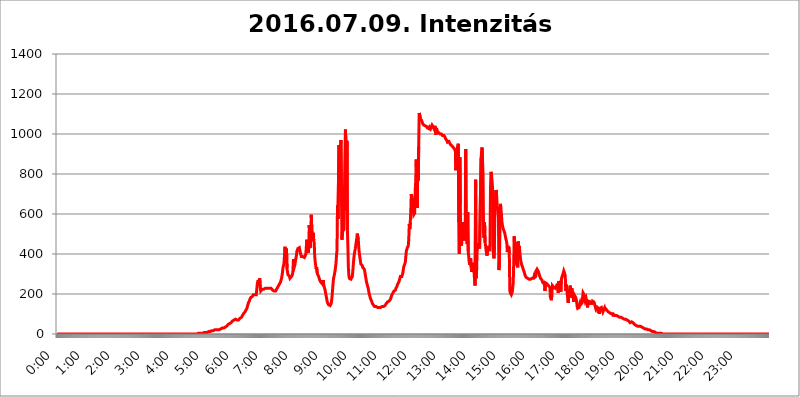
| Category | 2016.07.09. Intenzitás [W/m^2] |
|---|---|
| 0.0 | 0 |
| 0.0006944444444444445 | 0 |
| 0.001388888888888889 | 0 |
| 0.0020833333333333333 | 0 |
| 0.002777777777777778 | 0 |
| 0.003472222222222222 | 0 |
| 0.004166666666666667 | 0 |
| 0.004861111111111111 | 0 |
| 0.005555555555555556 | 0 |
| 0.0062499999999999995 | 0 |
| 0.006944444444444444 | 0 |
| 0.007638888888888889 | 0 |
| 0.008333333333333333 | 0 |
| 0.009027777777777779 | 0 |
| 0.009722222222222222 | 0 |
| 0.010416666666666666 | 0 |
| 0.011111111111111112 | 0 |
| 0.011805555555555555 | 0 |
| 0.012499999999999999 | 0 |
| 0.013194444444444444 | 0 |
| 0.013888888888888888 | 0 |
| 0.014583333333333332 | 0 |
| 0.015277777777777777 | 0 |
| 0.015972222222222224 | 0 |
| 0.016666666666666666 | 0 |
| 0.017361111111111112 | 0 |
| 0.018055555555555557 | 0 |
| 0.01875 | 0 |
| 0.019444444444444445 | 0 |
| 0.02013888888888889 | 0 |
| 0.020833333333333332 | 0 |
| 0.02152777777777778 | 0 |
| 0.022222222222222223 | 0 |
| 0.02291666666666667 | 0 |
| 0.02361111111111111 | 0 |
| 0.024305555555555556 | 0 |
| 0.024999999999999998 | 0 |
| 0.025694444444444447 | 0 |
| 0.02638888888888889 | 0 |
| 0.027083333333333334 | 0 |
| 0.027777777777777776 | 0 |
| 0.02847222222222222 | 0 |
| 0.029166666666666664 | 0 |
| 0.029861111111111113 | 0 |
| 0.030555555555555555 | 0 |
| 0.03125 | 0 |
| 0.03194444444444445 | 0 |
| 0.03263888888888889 | 0 |
| 0.03333333333333333 | 0 |
| 0.034027777777777775 | 0 |
| 0.034722222222222224 | 0 |
| 0.035416666666666666 | 0 |
| 0.036111111111111115 | 0 |
| 0.03680555555555556 | 0 |
| 0.0375 | 0 |
| 0.03819444444444444 | 0 |
| 0.03888888888888889 | 0 |
| 0.03958333333333333 | 0 |
| 0.04027777777777778 | 0 |
| 0.04097222222222222 | 0 |
| 0.041666666666666664 | 0 |
| 0.042361111111111106 | 0 |
| 0.04305555555555556 | 0 |
| 0.043750000000000004 | 0 |
| 0.044444444444444446 | 0 |
| 0.04513888888888889 | 0 |
| 0.04583333333333334 | 0 |
| 0.04652777777777778 | 0 |
| 0.04722222222222222 | 0 |
| 0.04791666666666666 | 0 |
| 0.04861111111111111 | 0 |
| 0.049305555555555554 | 0 |
| 0.049999999999999996 | 0 |
| 0.05069444444444445 | 0 |
| 0.051388888888888894 | 0 |
| 0.052083333333333336 | 0 |
| 0.05277777777777778 | 0 |
| 0.05347222222222222 | 0 |
| 0.05416666666666667 | 0 |
| 0.05486111111111111 | 0 |
| 0.05555555555555555 | 0 |
| 0.05625 | 0 |
| 0.05694444444444444 | 0 |
| 0.057638888888888885 | 0 |
| 0.05833333333333333 | 0 |
| 0.05902777777777778 | 0 |
| 0.059722222222222225 | 0 |
| 0.06041666666666667 | 0 |
| 0.061111111111111116 | 0 |
| 0.06180555555555556 | 0 |
| 0.0625 | 0 |
| 0.06319444444444444 | 0 |
| 0.06388888888888888 | 0 |
| 0.06458333333333334 | 0 |
| 0.06527777777777778 | 0 |
| 0.06597222222222222 | 0 |
| 0.06666666666666667 | 0 |
| 0.06736111111111111 | 0 |
| 0.06805555555555555 | 0 |
| 0.06874999999999999 | 0 |
| 0.06944444444444443 | 0 |
| 0.07013888888888889 | 0 |
| 0.07083333333333333 | 0 |
| 0.07152777777777779 | 0 |
| 0.07222222222222223 | 0 |
| 0.07291666666666667 | 0 |
| 0.07361111111111111 | 0 |
| 0.07430555555555556 | 0 |
| 0.075 | 0 |
| 0.07569444444444444 | 0 |
| 0.0763888888888889 | 0 |
| 0.07708333333333334 | 0 |
| 0.07777777777777778 | 0 |
| 0.07847222222222222 | 0 |
| 0.07916666666666666 | 0 |
| 0.0798611111111111 | 0 |
| 0.08055555555555556 | 0 |
| 0.08125 | 0 |
| 0.08194444444444444 | 0 |
| 0.08263888888888889 | 0 |
| 0.08333333333333333 | 0 |
| 0.08402777777777777 | 0 |
| 0.08472222222222221 | 0 |
| 0.08541666666666665 | 0 |
| 0.08611111111111112 | 0 |
| 0.08680555555555557 | 0 |
| 0.08750000000000001 | 0 |
| 0.08819444444444445 | 0 |
| 0.08888888888888889 | 0 |
| 0.08958333333333333 | 0 |
| 0.09027777777777778 | 0 |
| 0.09097222222222222 | 0 |
| 0.09166666666666667 | 0 |
| 0.09236111111111112 | 0 |
| 0.09305555555555556 | 0 |
| 0.09375 | 0 |
| 0.09444444444444444 | 0 |
| 0.09513888888888888 | 0 |
| 0.09583333333333333 | 0 |
| 0.09652777777777777 | 0 |
| 0.09722222222222222 | 0 |
| 0.09791666666666667 | 0 |
| 0.09861111111111111 | 0 |
| 0.09930555555555555 | 0 |
| 0.09999999999999999 | 0 |
| 0.10069444444444443 | 0 |
| 0.1013888888888889 | 0 |
| 0.10208333333333335 | 0 |
| 0.10277777777777779 | 0 |
| 0.10347222222222223 | 0 |
| 0.10416666666666667 | 0 |
| 0.10486111111111111 | 0 |
| 0.10555555555555556 | 0 |
| 0.10625 | 0 |
| 0.10694444444444444 | 0 |
| 0.1076388888888889 | 0 |
| 0.10833333333333334 | 0 |
| 0.10902777777777778 | 0 |
| 0.10972222222222222 | 0 |
| 0.1111111111111111 | 0 |
| 0.11180555555555556 | 0 |
| 0.11180555555555556 | 0 |
| 0.1125 | 0 |
| 0.11319444444444444 | 0 |
| 0.11388888888888889 | 0 |
| 0.11458333333333333 | 0 |
| 0.11527777777777777 | 0 |
| 0.11597222222222221 | 0 |
| 0.11666666666666665 | 0 |
| 0.1173611111111111 | 0 |
| 0.11805555555555557 | 0 |
| 0.11944444444444445 | 0 |
| 0.12013888888888889 | 0 |
| 0.12083333333333333 | 0 |
| 0.12152777777777778 | 0 |
| 0.12222222222222223 | 0 |
| 0.12291666666666667 | 0 |
| 0.12291666666666667 | 0 |
| 0.12361111111111112 | 0 |
| 0.12430555555555556 | 0 |
| 0.125 | 0 |
| 0.12569444444444444 | 0 |
| 0.12638888888888888 | 0 |
| 0.12708333333333333 | 0 |
| 0.16875 | 0 |
| 0.12847222222222224 | 0 |
| 0.12916666666666668 | 0 |
| 0.12986111111111112 | 0 |
| 0.13055555555555556 | 0 |
| 0.13125 | 0 |
| 0.13194444444444445 | 0 |
| 0.1326388888888889 | 0 |
| 0.13333333333333333 | 0 |
| 0.13402777777777777 | 0 |
| 0.13402777777777777 | 0 |
| 0.13472222222222222 | 0 |
| 0.13541666666666666 | 0 |
| 0.1361111111111111 | 0 |
| 0.13749999999999998 | 0 |
| 0.13819444444444443 | 0 |
| 0.1388888888888889 | 0 |
| 0.13958333333333334 | 0 |
| 0.14027777777777778 | 0 |
| 0.14097222222222222 | 0 |
| 0.14166666666666666 | 0 |
| 0.1423611111111111 | 0 |
| 0.14305555555555557 | 0 |
| 0.14375000000000002 | 0 |
| 0.14444444444444446 | 0 |
| 0.1451388888888889 | 0 |
| 0.1451388888888889 | 0 |
| 0.14652777777777778 | 0 |
| 0.14722222222222223 | 0 |
| 0.14791666666666667 | 0 |
| 0.1486111111111111 | 0 |
| 0.14930555555555555 | 0 |
| 0.15 | 0 |
| 0.15069444444444444 | 0 |
| 0.15138888888888888 | 0 |
| 0.15208333333333332 | 0 |
| 0.15277777777777776 | 0 |
| 0.15347222222222223 | 0 |
| 0.15416666666666667 | 0 |
| 0.15486111111111112 | 0 |
| 0.15555555555555556 | 0 |
| 0.15625 | 0 |
| 0.15694444444444444 | 0 |
| 0.15763888888888888 | 0 |
| 0.15833333333333333 | 0 |
| 0.15902777777777777 | 0 |
| 0.15972222222222224 | 0 |
| 0.16041666666666668 | 0 |
| 0.16111111111111112 | 0 |
| 0.16180555555555556 | 0 |
| 0.1625 | 0 |
| 0.16319444444444445 | 0 |
| 0.1638888888888889 | 0 |
| 0.16458333333333333 | 0 |
| 0.16527777777777777 | 0 |
| 0.16597222222222222 | 0 |
| 0.16666666666666666 | 0 |
| 0.1673611111111111 | 0 |
| 0.16805555555555554 | 0 |
| 0.16874999999999998 | 0 |
| 0.16944444444444443 | 0 |
| 0.17013888888888887 | 0 |
| 0.1708333333333333 | 0 |
| 0.17152777777777775 | 0 |
| 0.17222222222222225 | 0 |
| 0.1729166666666667 | 0 |
| 0.17361111111111113 | 0 |
| 0.17430555555555557 | 0 |
| 0.17500000000000002 | 0 |
| 0.17569444444444446 | 0 |
| 0.1763888888888889 | 0 |
| 0.17708333333333334 | 0 |
| 0.17777777777777778 | 0 |
| 0.17847222222222223 | 0 |
| 0.17916666666666667 | 0 |
| 0.1798611111111111 | 0 |
| 0.18055555555555555 | 0 |
| 0.18125 | 0 |
| 0.18194444444444444 | 0 |
| 0.1826388888888889 | 0 |
| 0.18333333333333335 | 0 |
| 0.1840277777777778 | 0 |
| 0.18472222222222223 | 0 |
| 0.18541666666666667 | 0 |
| 0.18611111111111112 | 0 |
| 0.18680555555555556 | 0 |
| 0.1875 | 0 |
| 0.18819444444444444 | 0 |
| 0.18888888888888888 | 0 |
| 0.18958333333333333 | 0 |
| 0.19027777777777777 | 0 |
| 0.1909722222222222 | 0 |
| 0.19166666666666665 | 0 |
| 0.19236111111111112 | 0 |
| 0.19305555555555554 | 0 |
| 0.19375 | 0 |
| 0.19444444444444445 | 0 |
| 0.1951388888888889 | 0 |
| 0.19583333333333333 | 0 |
| 0.19652777777777777 | 0 |
| 0.19722222222222222 | 0 |
| 0.19791666666666666 | 3.525 |
| 0.1986111111111111 | 3.525 |
| 0.19930555555555554 | 3.525 |
| 0.19999999999999998 | 3.525 |
| 0.20069444444444443 | 3.525 |
| 0.20138888888888887 | 3.525 |
| 0.2020833333333333 | 3.525 |
| 0.2027777777777778 | 3.525 |
| 0.2034722222222222 | 3.525 |
| 0.2041666666666667 | 3.525 |
| 0.20486111111111113 | 3.525 |
| 0.20555555555555557 | 3.525 |
| 0.20625000000000002 | 7.887 |
| 0.20694444444444446 | 7.887 |
| 0.2076388888888889 | 7.887 |
| 0.20833333333333334 | 7.887 |
| 0.20902777777777778 | 7.887 |
| 0.20972222222222223 | 7.887 |
| 0.21041666666666667 | 7.887 |
| 0.2111111111111111 | 7.887 |
| 0.21180555555555555 | 12.257 |
| 0.2125 | 12.257 |
| 0.21319444444444444 | 12.257 |
| 0.2138888888888889 | 12.257 |
| 0.21458333333333335 | 12.257 |
| 0.2152777777777778 | 12.257 |
| 0.21597222222222223 | 16.636 |
| 0.21666666666666667 | 16.636 |
| 0.21736111111111112 | 16.636 |
| 0.21805555555555556 | 16.636 |
| 0.21875 | 16.636 |
| 0.21944444444444444 | 21.024 |
| 0.22013888888888888 | 21.024 |
| 0.22083333333333333 | 21.024 |
| 0.22152777777777777 | 21.024 |
| 0.2222222222222222 | 21.024 |
| 0.22291666666666665 | 21.024 |
| 0.2236111111111111 | 21.024 |
| 0.22430555555555556 | 21.024 |
| 0.225 | 21.024 |
| 0.22569444444444445 | 21.024 |
| 0.2263888888888889 | 21.024 |
| 0.22708333333333333 | 21.024 |
| 0.22777777777777777 | 25.419 |
| 0.22847222222222222 | 25.419 |
| 0.22916666666666666 | 25.419 |
| 0.2298611111111111 | 25.419 |
| 0.23055555555555554 | 25.419 |
| 0.23124999999999998 | 29.823 |
| 0.23194444444444443 | 29.823 |
| 0.23263888888888887 | 29.823 |
| 0.2333333333333333 | 29.823 |
| 0.2340277777777778 | 29.823 |
| 0.2347222222222222 | 34.234 |
| 0.2354166666666667 | 34.234 |
| 0.23611111111111113 | 34.234 |
| 0.23680555555555557 | 38.653 |
| 0.23750000000000002 | 38.653 |
| 0.23819444444444446 | 43.079 |
| 0.2388888888888889 | 43.079 |
| 0.23958333333333334 | 47.511 |
| 0.24027777777777778 | 47.511 |
| 0.24097222222222223 | 47.511 |
| 0.24166666666666667 | 51.951 |
| 0.2423611111111111 | 51.951 |
| 0.24305555555555555 | 56.398 |
| 0.24375 | 56.398 |
| 0.24444444444444446 | 60.85 |
| 0.24513888888888888 | 60.85 |
| 0.24583333333333335 | 65.31 |
| 0.2465277777777778 | 65.31 |
| 0.24722222222222223 | 69.775 |
| 0.24791666666666667 | 69.775 |
| 0.24861111111111112 | 74.246 |
| 0.24930555555555556 | 74.246 |
| 0.25 | 74.246 |
| 0.25069444444444444 | 74.246 |
| 0.2513888888888889 | 74.246 |
| 0.2520833333333333 | 69.775 |
| 0.25277777777777777 | 69.775 |
| 0.2534722222222222 | 69.775 |
| 0.25416666666666665 | 69.775 |
| 0.2548611111111111 | 69.775 |
| 0.2555555555555556 | 74.246 |
| 0.25625000000000003 | 78.722 |
| 0.2569444444444445 | 78.722 |
| 0.2576388888888889 | 83.205 |
| 0.25833333333333336 | 83.205 |
| 0.2590277777777778 | 87.692 |
| 0.25972222222222224 | 92.184 |
| 0.2604166666666667 | 96.682 |
| 0.2611111111111111 | 101.184 |
| 0.26180555555555557 | 105.69 |
| 0.2625 | 105.69 |
| 0.26319444444444445 | 110.201 |
| 0.2638888888888889 | 114.716 |
| 0.26458333333333334 | 119.235 |
| 0.2652777777777778 | 123.758 |
| 0.2659722222222222 | 128.284 |
| 0.26666666666666666 | 137.347 |
| 0.2673611111111111 | 146.423 |
| 0.26805555555555555 | 155.509 |
| 0.26875 | 160.056 |
| 0.26944444444444443 | 164.605 |
| 0.2701388888888889 | 173.709 |
| 0.2708333333333333 | 178.264 |
| 0.27152777777777776 | 182.82 |
| 0.2722222222222222 | 182.82 |
| 0.27291666666666664 | 187.378 |
| 0.2736111111111111 | 187.378 |
| 0.2743055555555555 | 191.937 |
| 0.27499999999999997 | 196.497 |
| 0.27569444444444446 | 196.497 |
| 0.27638888888888885 | 196.497 |
| 0.27708333333333335 | 196.497 |
| 0.2777777777777778 | 191.937 |
| 0.27847222222222223 | 191.937 |
| 0.2791666666666667 | 196.497 |
| 0.2798611111111111 | 201.058 |
| 0.28055555555555556 | 251.251 |
| 0.28125 | 260.373 |
| 0.28194444444444444 | 269.49 |
| 0.2826388888888889 | 242.127 |
| 0.2833333333333333 | 269.49 |
| 0.28402777777777777 | 278.603 |
| 0.2847222222222222 | 233 |
| 0.28541666666666665 | 214.746 |
| 0.28611111111111115 | 214.746 |
| 0.28680555555555554 | 219.309 |
| 0.28750000000000003 | 223.873 |
| 0.2881944444444445 | 223.873 |
| 0.2888888888888889 | 223.873 |
| 0.28958333333333336 | 223.873 |
| 0.2902777777777778 | 223.873 |
| 0.29097222222222224 | 228.436 |
| 0.2916666666666667 | 228.436 |
| 0.2923611111111111 | 228.436 |
| 0.29305555555555557 | 228.436 |
| 0.29375 | 228.436 |
| 0.29444444444444445 | 228.436 |
| 0.2951388888888889 | 228.436 |
| 0.29583333333333334 | 228.436 |
| 0.2965277777777778 | 228.436 |
| 0.2972222222222222 | 228.436 |
| 0.29791666666666666 | 228.436 |
| 0.2986111111111111 | 228.436 |
| 0.29930555555555555 | 228.436 |
| 0.3 | 228.436 |
| 0.30069444444444443 | 223.873 |
| 0.3013888888888889 | 223.873 |
| 0.3020833333333333 | 219.309 |
| 0.30277777777777776 | 219.309 |
| 0.3034722222222222 | 214.746 |
| 0.30416666666666664 | 214.746 |
| 0.3048611111111111 | 214.746 |
| 0.3055555555555555 | 214.746 |
| 0.30624999999999997 | 214.746 |
| 0.3069444444444444 | 219.309 |
| 0.3076388888888889 | 223.873 |
| 0.30833333333333335 | 228.436 |
| 0.3090277777777778 | 233 |
| 0.30972222222222223 | 237.564 |
| 0.3104166666666667 | 242.127 |
| 0.3111111111111111 | 246.689 |
| 0.31180555555555556 | 251.251 |
| 0.3125 | 255.813 |
| 0.31319444444444444 | 260.373 |
| 0.3138888888888889 | 269.49 |
| 0.3145833333333333 | 278.603 |
| 0.31527777777777777 | 292.259 |
| 0.3159722222222222 | 310.44 |
| 0.31666666666666665 | 333.113 |
| 0.31736111111111115 | 342.162 |
| 0.31805555555555554 | 355.712 |
| 0.31875000000000003 | 360.221 |
| 0.3194444444444445 | 436.27 |
| 0.3201388888888889 | 382.715 |
| 0.32083333333333336 | 409.574 |
| 0.3215277777777778 | 427.39 |
| 0.32222222222222224 | 328.584 |
| 0.3229166666666667 | 310.44 |
| 0.3236111111111111 | 296.808 |
| 0.32430555555555557 | 296.808 |
| 0.325 | 292.259 |
| 0.32569444444444445 | 287.709 |
| 0.3263888888888889 | 278.603 |
| 0.32708333333333334 | 278.603 |
| 0.3277777777777778 | 278.603 |
| 0.3284722222222222 | 287.709 |
| 0.32916666666666666 | 292.259 |
| 0.3298611111111111 | 296.808 |
| 0.33055555555555555 | 314.98 |
| 0.33125 | 373.729 |
| 0.33194444444444443 | 346.682 |
| 0.3326388888888889 | 337.639 |
| 0.3333333333333333 | 346.682 |
| 0.3340277777777778 | 364.728 |
| 0.3347222222222222 | 378.224 |
| 0.3354166666666667 | 391.685 |
| 0.3361111111111111 | 414.035 |
| 0.3368055555555556 | 409.574 |
| 0.33749999999999997 | 427.39 |
| 0.33819444444444446 | 431.833 |
| 0.33888888888888885 | 422.943 |
| 0.33958333333333335 | 431.833 |
| 0.34027777777777773 | 427.39 |
| 0.34097222222222223 | 405.108 |
| 0.3416666666666666 | 396.164 |
| 0.3423611111111111 | 387.202 |
| 0.3430555555555555 | 387.202 |
| 0.34375 | 387.202 |
| 0.3444444444444445 | 387.202 |
| 0.3451388888888889 | 387.202 |
| 0.3458333333333334 | 387.202 |
| 0.34652777777777777 | 382.715 |
| 0.34722222222222227 | 382.715 |
| 0.34791666666666665 | 391.685 |
| 0.34861111111111115 | 400.638 |
| 0.34930555555555554 | 431.833 |
| 0.35000000000000003 | 471.582 |
| 0.3506944444444444 | 427.39 |
| 0.3513888888888889 | 414.035 |
| 0.3520833333333333 | 405.108 |
| 0.3527777777777778 | 431.833 |
| 0.3534722222222222 | 545.416 |
| 0.3541666666666667 | 471.582 |
| 0.3548611111111111 | 431.833 |
| 0.35555555555555557 | 475.972 |
| 0.35625 | 596.45 |
| 0.35694444444444445 | 592.233 |
| 0.3576388888888889 | 467.187 |
| 0.35833333333333334 | 497.836 |
| 0.3590277777777778 | 506.542 |
| 0.3597222222222222 | 467.187 |
| 0.36041666666666666 | 453.968 |
| 0.3611111111111111 | 387.202 |
| 0.36180555555555555 | 360.221 |
| 0.3625 | 342.162 |
| 0.36319444444444443 | 324.052 |
| 0.3638888888888889 | 333.113 |
| 0.3645833333333333 | 305.898 |
| 0.3652777777777778 | 296.808 |
| 0.3659722222222222 | 292.259 |
| 0.3666666666666667 | 287.709 |
| 0.3673611111111111 | 278.603 |
| 0.3680555555555556 | 269.49 |
| 0.36874999999999997 | 264.932 |
| 0.36944444444444446 | 260.373 |
| 0.37013888888888885 | 260.373 |
| 0.37083333333333335 | 255.813 |
| 0.37152777777777773 | 251.251 |
| 0.37222222222222223 | 251.251 |
| 0.3729166666666666 | 269.49 |
| 0.3736111111111111 | 251.251 |
| 0.3743055555555555 | 237.564 |
| 0.375 | 228.436 |
| 0.3756944444444445 | 219.309 |
| 0.3763888888888889 | 205.62 |
| 0.3770833333333334 | 191.937 |
| 0.37777777777777777 | 178.264 |
| 0.37847222222222227 | 164.605 |
| 0.37916666666666665 | 155.509 |
| 0.37986111111111115 | 150.964 |
| 0.38055555555555554 | 146.423 |
| 0.38125000000000003 | 141.884 |
| 0.3819444444444444 | 141.884 |
| 0.3826388888888889 | 141.884 |
| 0.3833333333333333 | 146.423 |
| 0.3840277777777778 | 150.964 |
| 0.3847222222222222 | 164.605 |
| 0.3854166666666667 | 187.378 |
| 0.3861111111111111 | 219.309 |
| 0.38680555555555557 | 251.251 |
| 0.3875 | 278.603 |
| 0.38819444444444445 | 287.709 |
| 0.3888888888888889 | 301.354 |
| 0.38958333333333334 | 314.98 |
| 0.3902777777777778 | 333.113 |
| 0.3909722222222222 | 355.712 |
| 0.39166666666666666 | 391.685 |
| 0.3923611111111111 | 418.492 |
| 0.39305555555555555 | 642.4 |
| 0.39375 | 575.299 |
| 0.39444444444444443 | 579.542 |
| 0.3951388888888889 | 943.832 |
| 0.3958333333333333 | 917.534 |
| 0.3965277777777778 | 909.996 |
| 0.3972222222222222 | 940.082 |
| 0.3979166666666667 | 970.034 |
| 0.3986111111111111 | 687.544 |
| 0.3993055555555556 | 471.582 |
| 0.39999999999999997 | 515.223 |
| 0.40069444444444446 | 536.82 |
| 0.40138888888888885 | 515.223 |
| 0.40208333333333335 | 528.2 |
| 0.40277777777777773 | 703.762 |
| 0.40347222222222223 | 879.719 |
| 0.4041666666666666 | 1022.323 |
| 0.4048611111111111 | 958.814 |
| 0.4055555555555555 | 617.436 |
| 0.40625 | 966.295 |
| 0.4069444444444445 | 523.88 |
| 0.4076388888888889 | 436.27 |
| 0.4083333333333334 | 333.113 |
| 0.40902777777777777 | 292.259 |
| 0.40972222222222227 | 278.603 |
| 0.41041666666666665 | 278.603 |
| 0.41111111111111115 | 278.603 |
| 0.41180555555555554 | 274.047 |
| 0.41250000000000003 | 269.49 |
| 0.4131944444444444 | 274.047 |
| 0.4138888888888889 | 287.709 |
| 0.4145833333333333 | 314.98 |
| 0.4152777777777778 | 351.198 |
| 0.4159722222222222 | 378.224 |
| 0.4166666666666667 | 400.638 |
| 0.4173611111111111 | 414.035 |
| 0.41805555555555557 | 427.39 |
| 0.41875 | 431.833 |
| 0.41944444444444445 | 462.786 |
| 0.4201388888888889 | 480.356 |
| 0.42083333333333334 | 502.192 |
| 0.4215277777777778 | 497.836 |
| 0.4222222222222222 | 471.582 |
| 0.42291666666666666 | 431.833 |
| 0.4236111111111111 | 405.108 |
| 0.42430555555555555 | 387.202 |
| 0.425 | 369.23 |
| 0.42569444444444443 | 351.198 |
| 0.4263888888888889 | 346.682 |
| 0.4270833333333333 | 346.682 |
| 0.4277777777777778 | 342.162 |
| 0.4284722222222222 | 333.113 |
| 0.4291666666666667 | 333.113 |
| 0.4298611111111111 | 328.584 |
| 0.4305555555555556 | 324.052 |
| 0.43124999999999997 | 314.98 |
| 0.43194444444444446 | 296.808 |
| 0.43263888888888885 | 283.156 |
| 0.43333333333333335 | 269.49 |
| 0.43402777777777773 | 255.813 |
| 0.43472222222222223 | 246.689 |
| 0.4354166666666666 | 237.564 |
| 0.4361111111111111 | 228.436 |
| 0.4368055555555555 | 214.746 |
| 0.4375 | 201.058 |
| 0.4381944444444445 | 191.937 |
| 0.4388888888888889 | 182.82 |
| 0.4395833333333334 | 173.709 |
| 0.44027777777777777 | 169.156 |
| 0.44097222222222227 | 164.605 |
| 0.44166666666666665 | 155.509 |
| 0.44236111111111115 | 150.964 |
| 0.44305555555555554 | 146.423 |
| 0.44375000000000003 | 146.423 |
| 0.4444444444444444 | 141.884 |
| 0.4451388888888889 | 137.347 |
| 0.4458333333333333 | 137.347 |
| 0.4465277777777778 | 137.347 |
| 0.4472222222222222 | 137.347 |
| 0.4479166666666667 | 137.347 |
| 0.4486111111111111 | 137.347 |
| 0.44930555555555557 | 132.814 |
| 0.45 | 132.814 |
| 0.45069444444444445 | 132.814 |
| 0.4513888888888889 | 132.814 |
| 0.45208333333333334 | 132.814 |
| 0.4527777777777778 | 132.814 |
| 0.4534722222222222 | 132.814 |
| 0.45416666666666666 | 132.814 |
| 0.4548611111111111 | 132.814 |
| 0.45555555555555555 | 137.347 |
| 0.45625 | 137.347 |
| 0.45694444444444443 | 137.347 |
| 0.4576388888888889 | 137.347 |
| 0.4583333333333333 | 137.347 |
| 0.4590277777777778 | 137.347 |
| 0.4597222222222222 | 141.884 |
| 0.4604166666666667 | 146.423 |
| 0.4611111111111111 | 150.964 |
| 0.4618055555555556 | 155.509 |
| 0.46249999999999997 | 155.509 |
| 0.46319444444444446 | 160.056 |
| 0.46388888888888885 | 160.056 |
| 0.46458333333333335 | 164.605 |
| 0.46527777777777773 | 164.605 |
| 0.46597222222222223 | 169.156 |
| 0.4666666666666666 | 169.156 |
| 0.4673611111111111 | 173.709 |
| 0.4680555555555555 | 182.82 |
| 0.46875 | 187.378 |
| 0.4694444444444445 | 196.497 |
| 0.4701388888888889 | 201.058 |
| 0.4708333333333334 | 205.62 |
| 0.47152777777777777 | 210.182 |
| 0.47222222222222227 | 214.746 |
| 0.47291666666666665 | 219.309 |
| 0.47361111111111115 | 219.309 |
| 0.47430555555555554 | 219.309 |
| 0.47500000000000003 | 228.436 |
| 0.4756944444444444 | 233 |
| 0.4763888888888889 | 237.564 |
| 0.4770833333333333 | 246.689 |
| 0.4777777777777778 | 251.251 |
| 0.4784722222222222 | 251.251 |
| 0.4791666666666667 | 260.373 |
| 0.4798611111111111 | 269.49 |
| 0.48055555555555557 | 278.603 |
| 0.48125 | 287.709 |
| 0.48194444444444445 | 287.709 |
| 0.4826388888888889 | 287.709 |
| 0.48333333333333334 | 287.709 |
| 0.4840277777777778 | 292.259 |
| 0.4847222222222222 | 305.898 |
| 0.48541666666666666 | 324.052 |
| 0.4861111111111111 | 337.639 |
| 0.48680555555555555 | 342.162 |
| 0.4875 | 351.198 |
| 0.48819444444444443 | 360.221 |
| 0.4888888888888889 | 387.202 |
| 0.4895833333333333 | 414.035 |
| 0.4902777777777778 | 422.943 |
| 0.4909722222222222 | 431.833 |
| 0.4916666666666667 | 436.27 |
| 0.4923611111111111 | 440.702 |
| 0.4930555555555556 | 475.972 |
| 0.49374999999999997 | 549.704 |
| 0.49444444444444446 | 523.88 |
| 0.49513888888888885 | 558.261 |
| 0.49583333333333335 | 613.252 |
| 0.49652777777777773 | 699.717 |
| 0.49722222222222223 | 683.473 |
| 0.4979166666666666 | 667.123 |
| 0.4986111111111111 | 663.019 |
| 0.4993055555555555 | 621.613 |
| 0.5 | 596.45 |
| 0.5006944444444444 | 592.233 |
| 0.5013888888888889 | 604.864 |
| 0.5020833333333333 | 719.877 |
| 0.5027777777777778 | 763.674 |
| 0.5034722222222222 | 872.114 |
| 0.5041666666666667 | 767.62 |
| 0.5048611111111111 | 629.948 |
| 0.5055555555555555 | 822.26 |
| 0.50625 | 767.62 |
| 0.5069444444444444 | 936.33 |
| 0.5076388888888889 | 1105.019 |
| 0.5083333333333333 | 1101.226 |
| 0.5090277777777777 | 1086.097 |
| 0.5097222222222222 | 1074.789 |
| 0.5104166666666666 | 1071.027 |
| 0.5111111111111112 | 1067.267 |
| 0.5118055555555555 | 1059.756 |
| 0.5125000000000001 | 1052.255 |
| 0.5131944444444444 | 1048.508 |
| 0.513888888888889 | 1044.762 |
| 0.5145833333333333 | 1044.762 |
| 0.5152777777777778 | 1044.762 |
| 0.5159722222222222 | 1041.019 |
| 0.5166666666666667 | 1037.277 |
| 0.517361111111111 | 1037.277 |
| 0.5180555555555556 | 1037.277 |
| 0.5187499999999999 | 1033.537 |
| 0.5194444444444445 | 1029.798 |
| 0.5201388888888888 | 1026.06 |
| 0.5208333333333334 | 1029.798 |
| 0.5215277777777778 | 1026.06 |
| 0.5222222222222223 | 1033.537 |
| 0.5229166666666667 | 1029.798 |
| 0.5236111111111111 | 1026.06 |
| 0.5243055555555556 | 1026.06 |
| 0.525 | 1026.06 |
| 0.5256944444444445 | 1044.762 |
| 0.5263888888888889 | 1048.508 |
| 0.5270833333333333 | 1037.277 |
| 0.5277777777777778 | 1037.277 |
| 0.5284722222222222 | 1026.06 |
| 0.5291666666666667 | 1026.06 |
| 0.5298611111111111 | 1041.019 |
| 0.5305555555555556 | 1041.019 |
| 0.53125 | 996.182 |
| 0.5319444444444444 | 1029.798 |
| 0.5326388888888889 | 1014.852 |
| 0.5333333333333333 | 1018.587 |
| 0.5340277777777778 | 1011.118 |
| 0.5347222222222222 | 1007.383 |
| 0.5354166666666667 | 1007.383 |
| 0.5361111111111111 | 1003.65 |
| 0.5368055555555555 | 999.916 |
| 0.5375 | 999.916 |
| 0.5381944444444444 | 996.182 |
| 0.5388888888888889 | 999.916 |
| 0.5395833333333333 | 996.182 |
| 0.5402777777777777 | 992.448 |
| 0.5409722222222222 | 992.448 |
| 0.5416666666666666 | 992.448 |
| 0.5423611111111112 | 992.448 |
| 0.5430555555555555 | 988.714 |
| 0.5437500000000001 | 984.98 |
| 0.5444444444444444 | 977.508 |
| 0.545138888888889 | 973.772 |
| 0.5458333333333333 | 973.772 |
| 0.5465277777777778 | 966.295 |
| 0.5472222222222222 | 958.814 |
| 0.5479166666666667 | 958.814 |
| 0.548611111111111 | 958.814 |
| 0.5493055555555556 | 962.555 |
| 0.5499999999999999 | 962.555 |
| 0.5506944444444445 | 958.814 |
| 0.5513888888888888 | 947.58 |
| 0.5520833333333334 | 947.58 |
| 0.5527777777777778 | 947.58 |
| 0.5534722222222223 | 940.082 |
| 0.5541666666666667 | 940.082 |
| 0.5548611111111111 | 940.082 |
| 0.5555555555555556 | 932.576 |
| 0.55625 | 928.819 |
| 0.5569444444444445 | 925.06 |
| 0.5576388888888889 | 921.298 |
| 0.5583333333333333 | 917.534 |
| 0.5590277777777778 | 818.392 |
| 0.5597222222222222 | 906.223 |
| 0.5604166666666667 | 921.298 |
| 0.5611111111111111 | 917.534 |
| 0.5618055555555556 | 925.06 |
| 0.5625 | 951.327 |
| 0.5631944444444444 | 558.261 |
| 0.5638888888888889 | 400.638 |
| 0.5645833333333333 | 883.516 |
| 0.5652777777777778 | 646.537 |
| 0.5659722222222222 | 467.187 |
| 0.5666666666666667 | 440.702 |
| 0.5673611111111111 | 458.38 |
| 0.5680555555555555 | 489.108 |
| 0.56875 | 558.261 |
| 0.5694444444444444 | 489.108 |
| 0.5701388888888889 | 475.972 |
| 0.5708333333333333 | 467.187 |
| 0.5715277777777777 | 497.836 |
| 0.5722222222222222 | 523.88 |
| 0.5729166666666666 | 925.06 |
| 0.5736111111111112 | 489.108 |
| 0.5743055555555555 | 493.475 |
| 0.5750000000000001 | 449.551 |
| 0.5756944444444444 | 609.062 |
| 0.576388888888889 | 414.035 |
| 0.5770833333333333 | 387.202 |
| 0.5777777777777778 | 360.221 |
| 0.5784722222222222 | 346.682 |
| 0.5791666666666667 | 369.23 |
| 0.579861111111111 | 378.224 |
| 0.5805555555555556 | 333.113 |
| 0.5812499999999999 | 310.44 |
| 0.5819444444444445 | 305.898 |
| 0.5826388888888888 | 337.639 |
| 0.5833333333333334 | 355.712 |
| 0.5840277777777778 | 342.162 |
| 0.5847222222222223 | 301.354 |
| 0.5854166666666667 | 260.373 |
| 0.5861111111111111 | 242.127 |
| 0.5868055555555556 | 771.559 |
| 0.5875 | 278.603 |
| 0.5881944444444445 | 319.517 |
| 0.5888888888888889 | 414.035 |
| 0.5895833333333333 | 453.968 |
| 0.5902777777777778 | 440.702 |
| 0.5909722222222222 | 431.833 |
| 0.5916666666666667 | 449.551 |
| 0.5923611111111111 | 427.39 |
| 0.5930555555555556 | 431.833 |
| 0.59375 | 427.39 |
| 0.5944444444444444 | 879.719 |
| 0.5951388888888889 | 909.996 |
| 0.5958333333333333 | 932.576 |
| 0.5965277777777778 | 860.676 |
| 0.5972222222222222 | 795.074 |
| 0.5979166666666667 | 506.542 |
| 0.5986111111111111 | 480.356 |
| 0.5993055555555555 | 558.261 |
| 0.6 | 458.38 |
| 0.6006944444444444 | 445.129 |
| 0.6013888888888889 | 418.492 |
| 0.6020833333333333 | 405.108 |
| 0.6027777777777777 | 391.685 |
| 0.6034722222222222 | 409.574 |
| 0.6041666666666666 | 440.702 |
| 0.6048611111111112 | 431.833 |
| 0.6055555555555555 | 414.035 |
| 0.6062500000000001 | 427.39 |
| 0.6069444444444444 | 440.702 |
| 0.607638888888889 | 727.896 |
| 0.6083333333333333 | 810.641 |
| 0.6090277777777778 | 798.974 |
| 0.6097222222222222 | 767.62 |
| 0.6104166666666667 | 739.877 |
| 0.611111111111111 | 414.035 |
| 0.6118055555555556 | 405.108 |
| 0.6124999999999999 | 378.224 |
| 0.6131944444444445 | 436.27 |
| 0.6138888888888888 | 687.544 |
| 0.6145833333333334 | 663.019 |
| 0.6152777777777778 | 719.877 |
| 0.6159722222222223 | 707.8 |
| 0.6166666666666667 | 663.019 |
| 0.6173611111111111 | 629.948 |
| 0.6180555555555556 | 625.784 |
| 0.61875 | 583.779 |
| 0.6194444444444445 | 319.517 |
| 0.6201388888888889 | 360.221 |
| 0.6208333333333333 | 364.728 |
| 0.6215277777777778 | 650.667 |
| 0.6222222222222222 | 629.948 |
| 0.6229166666666667 | 600.661 |
| 0.6236111111111111 | 562.53 |
| 0.6243055555555556 | 545.416 |
| 0.625 | 532.513 |
| 0.6256944444444444 | 523.88 |
| 0.6263888888888889 | 519.555 |
| 0.6270833333333333 | 510.885 |
| 0.6277777777777778 | 502.192 |
| 0.6284722222222222 | 489.108 |
| 0.6291666666666667 | 475.972 |
| 0.6298611111111111 | 467.187 |
| 0.6305555555555555 | 453.968 |
| 0.63125 | 409.574 |
| 0.6319444444444444 | 440.702 |
| 0.6326388888888889 | 427.39 |
| 0.6333333333333333 | 436.27 |
| 0.6340277777777777 | 405.108 |
| 0.6347222222222222 | 219.309 |
| 0.6354166666666666 | 205.62 |
| 0.6361111111111112 | 201.058 |
| 0.6368055555555555 | 196.497 |
| 0.6375000000000001 | 196.497 |
| 0.6381944444444444 | 210.182 |
| 0.638888888888889 | 233 |
| 0.6395833333333333 | 260.373 |
| 0.6402777777777778 | 369.23 |
| 0.6409722222222222 | 489.108 |
| 0.6416666666666667 | 369.23 |
| 0.642361111111111 | 458.38 |
| 0.6430555555555556 | 391.685 |
| 0.6437499999999999 | 355.712 |
| 0.6444444444444445 | 346.682 |
| 0.6451388888888888 | 342.162 |
| 0.6458333333333334 | 333.113 |
| 0.6465277777777778 | 462.786 |
| 0.6472222222222223 | 422.943 |
| 0.6479166666666667 | 440.702 |
| 0.6486111111111111 | 414.035 |
| 0.6493055555555556 | 391.685 |
| 0.65 | 369.23 |
| 0.6506944444444445 | 355.712 |
| 0.6513888888888889 | 346.682 |
| 0.6520833333333333 | 342.162 |
| 0.6527777777777778 | 333.113 |
| 0.6534722222222222 | 324.052 |
| 0.6541666666666667 | 319.517 |
| 0.6548611111111111 | 310.44 |
| 0.6555555555555556 | 301.354 |
| 0.65625 | 292.259 |
| 0.6569444444444444 | 287.709 |
| 0.6576388888888889 | 283.156 |
| 0.6583333333333333 | 278.603 |
| 0.6590277777777778 | 278.603 |
| 0.6597222222222222 | 278.603 |
| 0.6604166666666667 | 278.603 |
| 0.6611111111111111 | 278.603 |
| 0.6618055555555555 | 274.047 |
| 0.6625 | 269.49 |
| 0.6631944444444444 | 274.047 |
| 0.6638888888888889 | 274.047 |
| 0.6645833333333333 | 274.047 |
| 0.6652777777777777 | 274.047 |
| 0.6659722222222222 | 278.603 |
| 0.6666666666666666 | 278.603 |
| 0.6673611111111111 | 278.603 |
| 0.6680555555555556 | 278.603 |
| 0.6687500000000001 | 287.709 |
| 0.6694444444444444 | 278.603 |
| 0.6701388888888888 | 301.354 |
| 0.6708333333333334 | 283.156 |
| 0.6715277777777778 | 314.98 |
| 0.6722222222222222 | 319.517 |
| 0.6729166666666666 | 324.052 |
| 0.6736111111111112 | 324.052 |
| 0.6743055555555556 | 319.517 |
| 0.6749999999999999 | 310.44 |
| 0.6756944444444444 | 301.354 |
| 0.6763888888888889 | 292.259 |
| 0.6770833333333334 | 287.709 |
| 0.6777777777777777 | 278.603 |
| 0.6784722222222223 | 274.047 |
| 0.6791666666666667 | 274.047 |
| 0.6798611111111111 | 269.49 |
| 0.6805555555555555 | 264.932 |
| 0.68125 | 255.813 |
| 0.6819444444444445 | 251.251 |
| 0.6826388888888889 | 251.251 |
| 0.6833333333333332 | 251.251 |
| 0.6840277777777778 | 214.746 |
| 0.6847222222222222 | 255.813 |
| 0.6854166666666667 | 255.813 |
| 0.686111111111111 | 251.251 |
| 0.6868055555555556 | 251.251 |
| 0.6875 | 246.689 |
| 0.6881944444444444 | 246.689 |
| 0.688888888888889 | 242.127 |
| 0.6895833333333333 | 242.127 |
| 0.6902777777777778 | 237.564 |
| 0.6909722222222222 | 233 |
| 0.6916666666666668 | 182.82 |
| 0.6923611111111111 | 182.82 |
| 0.6930555555555555 | 169.156 |
| 0.69375 | 201.058 |
| 0.6944444444444445 | 242.127 |
| 0.6951388888888889 | 242.127 |
| 0.6958333333333333 | 237.564 |
| 0.6965277777777777 | 233 |
| 0.6972222222222223 | 233 |
| 0.6979166666666666 | 228.436 |
| 0.6986111111111111 | 228.436 |
| 0.6993055555555556 | 233 |
| 0.7000000000000001 | 237.564 |
| 0.7006944444444444 | 242.127 |
| 0.7013888888888888 | 251.251 |
| 0.7020833333333334 | 255.813 |
| 0.7027777777777778 | 205.62 |
| 0.7034722222222222 | 264.932 |
| 0.7041666666666666 | 246.689 |
| 0.7048611111111112 | 210.182 |
| 0.7055555555555556 | 228.436 |
| 0.7062499999999999 | 210.182 |
| 0.7069444444444444 | 269.49 |
| 0.7076388888888889 | 283.156 |
| 0.7083333333333334 | 287.709 |
| 0.7090277777777777 | 296.808 |
| 0.7097222222222223 | 305.898 |
| 0.7104166666666667 | 314.98 |
| 0.7111111111111111 | 319.517 |
| 0.7118055555555555 | 310.44 |
| 0.7125 | 292.259 |
| 0.7131944444444445 | 214.746 |
| 0.7138888888888889 | 246.689 |
| 0.7145833333333332 | 228.436 |
| 0.7152777777777778 | 201.058 |
| 0.7159722222222222 | 196.497 |
| 0.7166666666666667 | 155.509 |
| 0.717361111111111 | 210.182 |
| 0.7180555555555556 | 210.182 |
| 0.71875 | 223.873 |
| 0.7194444444444444 | 242.127 |
| 0.720138888888889 | 242.127 |
| 0.7208333333333333 | 182.82 |
| 0.7215277777777778 | 228.436 |
| 0.7222222222222222 | 219.309 |
| 0.7229166666666668 | 210.182 |
| 0.7236111111111111 | 205.62 |
| 0.7243055555555555 | 160.056 |
| 0.725 | 182.82 |
| 0.7256944444444445 | 191.937 |
| 0.7263888888888889 | 187.378 |
| 0.7270833333333333 | 182.82 |
| 0.7277777777777777 | 182.82 |
| 0.7284722222222223 | 164.605 |
| 0.7291666666666666 | 137.347 |
| 0.7298611111111111 | 128.284 |
| 0.7305555555555556 | 128.284 |
| 0.7312500000000001 | 128.284 |
| 0.7319444444444444 | 132.814 |
| 0.7326388888888888 | 146.423 |
| 0.7333333333333334 | 155.509 |
| 0.7340277777777778 | 146.423 |
| 0.7347222222222222 | 150.964 |
| 0.7354166666666666 | 150.964 |
| 0.7361111111111112 | 155.509 |
| 0.7368055555555556 | 182.82 |
| 0.7374999999999999 | 205.62 |
| 0.7381944444444444 | 210.182 |
| 0.7388888888888889 | 196.497 |
| 0.7395833333333334 | 173.709 |
| 0.7402777777777777 | 164.605 |
| 0.7409722222222223 | 169.156 |
| 0.7416666666666667 | 178.264 |
| 0.7423611111111111 | 164.605 |
| 0.7430555555555555 | 164.605 |
| 0.74375 | 132.814 |
| 0.7444444444444445 | 164.605 |
| 0.7451388888888889 | 169.156 |
| 0.7458333333333332 | 160.056 |
| 0.7465277777777778 | 160.056 |
| 0.7472222222222222 | 146.423 |
| 0.7479166666666667 | 160.056 |
| 0.748611111111111 | 155.509 |
| 0.7493055555555556 | 160.056 |
| 0.75 | 155.509 |
| 0.7506944444444444 | 164.605 |
| 0.751388888888889 | 164.605 |
| 0.7520833333333333 | 164.605 |
| 0.7527777777777778 | 160.056 |
| 0.7534722222222222 | 155.509 |
| 0.7541666666666668 | 155.509 |
| 0.7548611111111111 | 132.814 |
| 0.7555555555555555 | 141.884 |
| 0.75625 | 128.284 |
| 0.7569444444444445 | 137.347 |
| 0.7576388888888889 | 137.347 |
| 0.7583333333333333 | 132.814 |
| 0.7590277777777777 | 105.69 |
| 0.7597222222222223 | 123.758 |
| 0.7604166666666666 | 101.184 |
| 0.7611111111111111 | 128.284 |
| 0.7618055555555556 | 132.814 |
| 0.7625000000000001 | 132.814 |
| 0.7631944444444444 | 132.814 |
| 0.7638888888888888 | 132.814 |
| 0.7645833333333334 | 132.814 |
| 0.7652777777777778 | 110.201 |
| 0.7659722222222222 | 110.201 |
| 0.7666666666666666 | 110.201 |
| 0.7673611111111112 | 128.284 |
| 0.7680555555555556 | 114.716 |
| 0.7687499999999999 | 128.284 |
| 0.7694444444444444 | 123.758 |
| 0.7701388888888889 | 123.758 |
| 0.7708333333333334 | 119.235 |
| 0.7715277777777777 | 119.235 |
| 0.7722222222222223 | 114.716 |
| 0.7729166666666667 | 110.201 |
| 0.7736111111111111 | 110.201 |
| 0.7743055555555555 | 105.69 |
| 0.775 | 105.69 |
| 0.7756944444444445 | 105.69 |
| 0.7763888888888889 | 101.184 |
| 0.7770833333333332 | 101.184 |
| 0.7777777777777778 | 101.184 |
| 0.7784722222222222 | 101.184 |
| 0.7791666666666667 | 101.184 |
| 0.779861111111111 | 87.692 |
| 0.7805555555555556 | 96.682 |
| 0.78125 | 96.682 |
| 0.7819444444444444 | 92.184 |
| 0.782638888888889 | 92.184 |
| 0.7833333333333333 | 92.184 |
| 0.7840277777777778 | 92.184 |
| 0.7847222222222222 | 92.184 |
| 0.7854166666666668 | 92.184 |
| 0.7861111111111111 | 87.692 |
| 0.7868055555555555 | 87.692 |
| 0.7875 | 87.692 |
| 0.7881944444444445 | 83.205 |
| 0.7888888888888889 | 83.205 |
| 0.7895833333333333 | 83.205 |
| 0.7902777777777777 | 83.205 |
| 0.7909722222222223 | 83.205 |
| 0.7916666666666666 | 83.205 |
| 0.7923611111111111 | 83.205 |
| 0.7930555555555556 | 78.722 |
| 0.7937500000000001 | 74.246 |
| 0.7944444444444444 | 74.246 |
| 0.7951388888888888 | 74.246 |
| 0.7958333333333334 | 74.246 |
| 0.7965277777777778 | 74.246 |
| 0.7972222222222222 | 74.246 |
| 0.7979166666666666 | 74.246 |
| 0.7986111111111112 | 74.246 |
| 0.7993055555555556 | 69.775 |
| 0.7999999999999999 | 69.775 |
| 0.8006944444444444 | 69.775 |
| 0.8013888888888889 | 65.31 |
| 0.8020833333333334 | 65.31 |
| 0.8027777777777777 | 65.31 |
| 0.8034722222222223 | 56.398 |
| 0.8041666666666667 | 56.398 |
| 0.8048611111111111 | 56.398 |
| 0.8055555555555555 | 60.85 |
| 0.80625 | 60.85 |
| 0.8069444444444445 | 60.85 |
| 0.8076388888888889 | 56.398 |
| 0.8083333333333332 | 56.398 |
| 0.8090277777777778 | 51.951 |
| 0.8097222222222222 | 47.511 |
| 0.8104166666666667 | 47.511 |
| 0.811111111111111 | 47.511 |
| 0.8118055555555556 | 43.079 |
| 0.8125 | 43.079 |
| 0.8131944444444444 | 38.653 |
| 0.813888888888889 | 38.653 |
| 0.8145833333333333 | 38.653 |
| 0.8152777777777778 | 38.653 |
| 0.8159722222222222 | 38.653 |
| 0.8166666666666668 | 38.653 |
| 0.8173611111111111 | 38.653 |
| 0.8180555555555555 | 38.653 |
| 0.81875 | 34.234 |
| 0.8194444444444445 | 34.234 |
| 0.8201388888888889 | 34.234 |
| 0.8208333333333333 | 29.823 |
| 0.8215277777777777 | 29.823 |
| 0.8222222222222223 | 29.823 |
| 0.8229166666666666 | 29.823 |
| 0.8236111111111111 | 25.419 |
| 0.8243055555555556 | 25.419 |
| 0.8250000000000001 | 25.419 |
| 0.8256944444444444 | 25.419 |
| 0.8263888888888888 | 25.419 |
| 0.8270833333333334 | 25.419 |
| 0.8277777777777778 | 25.419 |
| 0.8284722222222222 | 21.024 |
| 0.8291666666666666 | 21.024 |
| 0.8298611111111112 | 21.024 |
| 0.8305555555555556 | 21.024 |
| 0.8312499999999999 | 21.024 |
| 0.8319444444444444 | 21.024 |
| 0.8326388888888889 | 16.636 |
| 0.8333333333333334 | 16.636 |
| 0.8340277777777777 | 16.636 |
| 0.8347222222222223 | 12.257 |
| 0.8354166666666667 | 12.257 |
| 0.8361111111111111 | 12.257 |
| 0.8368055555555555 | 12.257 |
| 0.8375 | 7.887 |
| 0.8381944444444445 | 7.887 |
| 0.8388888888888889 | 7.887 |
| 0.8395833333333332 | 7.887 |
| 0.8402777777777778 | 7.887 |
| 0.8409722222222222 | 3.525 |
| 0.8416666666666667 | 3.525 |
| 0.842361111111111 | 3.525 |
| 0.8430555555555556 | 3.525 |
| 0.84375 | 3.525 |
| 0.8444444444444444 | 3.525 |
| 0.845138888888889 | 3.525 |
| 0.8458333333333333 | 3.525 |
| 0.8465277777777778 | 3.525 |
| 0.8472222222222222 | 3.525 |
| 0.8479166666666668 | 0 |
| 0.8486111111111111 | 0 |
| 0.8493055555555555 | 0 |
| 0.85 | 0 |
| 0.8506944444444445 | 0 |
| 0.8513888888888889 | 0 |
| 0.8520833333333333 | 0 |
| 0.8527777777777777 | 0 |
| 0.8534722222222223 | 0 |
| 0.8541666666666666 | 0 |
| 0.8548611111111111 | 0 |
| 0.8555555555555556 | 0 |
| 0.8562500000000001 | 0 |
| 0.8569444444444444 | 0 |
| 0.8576388888888888 | 0 |
| 0.8583333333333334 | 0 |
| 0.8590277777777778 | 0 |
| 0.8597222222222222 | 0 |
| 0.8604166666666666 | 0 |
| 0.8611111111111112 | 0 |
| 0.8618055555555556 | 0 |
| 0.8624999999999999 | 0 |
| 0.8631944444444444 | 0 |
| 0.8638888888888889 | 0 |
| 0.8645833333333334 | 0 |
| 0.8652777777777777 | 0 |
| 0.8659722222222223 | 0 |
| 0.8666666666666667 | 0 |
| 0.8673611111111111 | 0 |
| 0.8680555555555555 | 0 |
| 0.86875 | 0 |
| 0.8694444444444445 | 0 |
| 0.8701388888888889 | 0 |
| 0.8708333333333332 | 0 |
| 0.8715277777777778 | 0 |
| 0.8722222222222222 | 0 |
| 0.8729166666666667 | 0 |
| 0.873611111111111 | 0 |
| 0.8743055555555556 | 0 |
| 0.875 | 0 |
| 0.8756944444444444 | 0 |
| 0.876388888888889 | 0 |
| 0.8770833333333333 | 0 |
| 0.8777777777777778 | 0 |
| 0.8784722222222222 | 0 |
| 0.8791666666666668 | 0 |
| 0.8798611111111111 | 0 |
| 0.8805555555555555 | 0 |
| 0.88125 | 0 |
| 0.8819444444444445 | 0 |
| 0.8826388888888889 | 0 |
| 0.8833333333333333 | 0 |
| 0.8840277777777777 | 0 |
| 0.8847222222222223 | 0 |
| 0.8854166666666666 | 0 |
| 0.8861111111111111 | 0 |
| 0.8868055555555556 | 0 |
| 0.8875000000000001 | 0 |
| 0.8881944444444444 | 0 |
| 0.8888888888888888 | 0 |
| 0.8895833333333334 | 0 |
| 0.8902777777777778 | 0 |
| 0.8909722222222222 | 0 |
| 0.8916666666666666 | 0 |
| 0.8923611111111112 | 0 |
| 0.8930555555555556 | 0 |
| 0.8937499999999999 | 0 |
| 0.8944444444444444 | 0 |
| 0.8951388888888889 | 0 |
| 0.8958333333333334 | 0 |
| 0.8965277777777777 | 0 |
| 0.8972222222222223 | 0 |
| 0.8979166666666667 | 0 |
| 0.8986111111111111 | 0 |
| 0.8993055555555555 | 0 |
| 0.9 | 0 |
| 0.9006944444444445 | 0 |
| 0.9013888888888889 | 0 |
| 0.9020833333333332 | 0 |
| 0.9027777777777778 | 0 |
| 0.9034722222222222 | 0 |
| 0.9041666666666667 | 0 |
| 0.904861111111111 | 0 |
| 0.9055555555555556 | 0 |
| 0.90625 | 0 |
| 0.9069444444444444 | 0 |
| 0.907638888888889 | 0 |
| 0.9083333333333333 | 0 |
| 0.9090277777777778 | 0 |
| 0.9097222222222222 | 0 |
| 0.9104166666666668 | 0 |
| 0.9111111111111111 | 0 |
| 0.9118055555555555 | 0 |
| 0.9125 | 0 |
| 0.9131944444444445 | 0 |
| 0.9138888888888889 | 0 |
| 0.9145833333333333 | 0 |
| 0.9152777777777777 | 0 |
| 0.9159722222222223 | 0 |
| 0.9166666666666666 | 0 |
| 0.9173611111111111 | 0 |
| 0.9180555555555556 | 0 |
| 0.9187500000000001 | 0 |
| 0.9194444444444444 | 0 |
| 0.9201388888888888 | 0 |
| 0.9208333333333334 | 0 |
| 0.9215277777777778 | 0 |
| 0.9222222222222222 | 0 |
| 0.9229166666666666 | 0 |
| 0.9236111111111112 | 0 |
| 0.9243055555555556 | 0 |
| 0.9249999999999999 | 0 |
| 0.9256944444444444 | 0 |
| 0.9263888888888889 | 0 |
| 0.9270833333333334 | 0 |
| 0.9277777777777777 | 0 |
| 0.9284722222222223 | 0 |
| 0.9291666666666667 | 0 |
| 0.9298611111111111 | 0 |
| 0.9305555555555555 | 0 |
| 0.93125 | 0 |
| 0.9319444444444445 | 0 |
| 0.9326388888888889 | 0 |
| 0.9333333333333332 | 0 |
| 0.9340277777777778 | 0 |
| 0.9347222222222222 | 0 |
| 0.9354166666666667 | 0 |
| 0.936111111111111 | 0 |
| 0.9368055555555556 | 0 |
| 0.9375 | 0 |
| 0.9381944444444444 | 0 |
| 0.938888888888889 | 0 |
| 0.9395833333333333 | 0 |
| 0.9402777777777778 | 0 |
| 0.9409722222222222 | 0 |
| 0.9416666666666668 | 0 |
| 0.9423611111111111 | 0 |
| 0.9430555555555555 | 0 |
| 0.94375 | 0 |
| 0.9444444444444445 | 0 |
| 0.9451388888888889 | 0 |
| 0.9458333333333333 | 0 |
| 0.9465277777777777 | 0 |
| 0.9472222222222223 | 0 |
| 0.9479166666666666 | 0 |
| 0.9486111111111111 | 0 |
| 0.9493055555555556 | 0 |
| 0.9500000000000001 | 0 |
| 0.9506944444444444 | 0 |
| 0.9513888888888888 | 0 |
| 0.9520833333333334 | 0 |
| 0.9527777777777778 | 0 |
| 0.9534722222222222 | 0 |
| 0.9541666666666666 | 0 |
| 0.9548611111111112 | 0 |
| 0.9555555555555556 | 0 |
| 0.9562499999999999 | 0 |
| 0.9569444444444444 | 0 |
| 0.9576388888888889 | 0 |
| 0.9583333333333334 | 0 |
| 0.9590277777777777 | 0 |
| 0.9597222222222223 | 0 |
| 0.9604166666666667 | 0 |
| 0.9611111111111111 | 0 |
| 0.9618055555555555 | 0 |
| 0.9625 | 0 |
| 0.9631944444444445 | 0 |
| 0.9638888888888889 | 0 |
| 0.9645833333333332 | 0 |
| 0.9652777777777778 | 0 |
| 0.9659722222222222 | 0 |
| 0.9666666666666667 | 0 |
| 0.967361111111111 | 0 |
| 0.9680555555555556 | 0 |
| 0.96875 | 0 |
| 0.9694444444444444 | 0 |
| 0.970138888888889 | 0 |
| 0.9708333333333333 | 0 |
| 0.9715277777777778 | 0 |
| 0.9722222222222222 | 0 |
| 0.9729166666666668 | 0 |
| 0.9736111111111111 | 0 |
| 0.9743055555555555 | 0 |
| 0.975 | 0 |
| 0.9756944444444445 | 0 |
| 0.9763888888888889 | 0 |
| 0.9770833333333333 | 0 |
| 0.9777777777777777 | 0 |
| 0.9784722222222223 | 0 |
| 0.9791666666666666 | 0 |
| 0.9798611111111111 | 0 |
| 0.9805555555555556 | 0 |
| 0.9812500000000001 | 0 |
| 0.9819444444444444 | 0 |
| 0.9826388888888888 | 0 |
| 0.9833333333333334 | 0 |
| 0.9840277777777778 | 0 |
| 0.9847222222222222 | 0 |
| 0.9854166666666666 | 0 |
| 0.9861111111111112 | 0 |
| 0.9868055555555556 | 0 |
| 0.9874999999999999 | 0 |
| 0.9881944444444444 | 0 |
| 0.9888888888888889 | 0 |
| 0.9895833333333334 | 0 |
| 0.9902777777777777 | 0 |
| 0.9909722222222223 | 0 |
| 0.9916666666666667 | 0 |
| 0.9923611111111111 | 0 |
| 0.9930555555555555 | 0 |
| 0.99375 | 0 |
| 0.9944444444444445 | 0 |
| 0.9951388888888889 | 0 |
| 0.9958333333333332 | 0 |
| 0.9965277777777778 | 0 |
| 0.9972222222222222 | 0 |
| 0.9979166666666667 | 0 |
| 0.998611111111111 | 0 |
| 0.9993055555555556 | 0 |